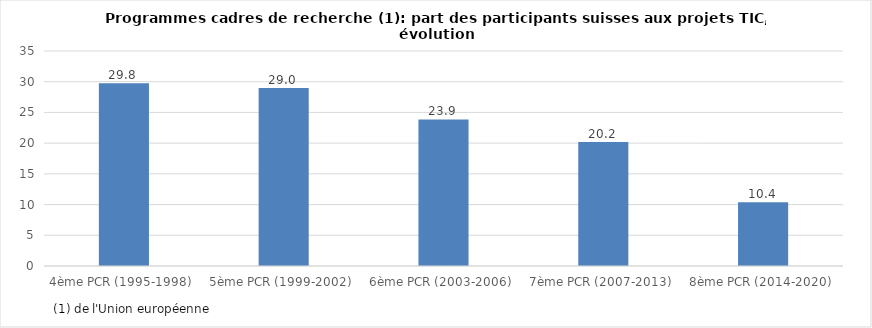
| Category | Series 0 |
|---|---|
| 4ème PCR (1995-1998)  | 29.759 |
| 5ème PCR (1999-2002)  | 28.988 |
| 6ème PCR (2003-2006)  | 23.852 |
| 7ème PCR (2007-2013)  | 20.196 |
| 8ème PCR (2014-2020)  | 10.396 |